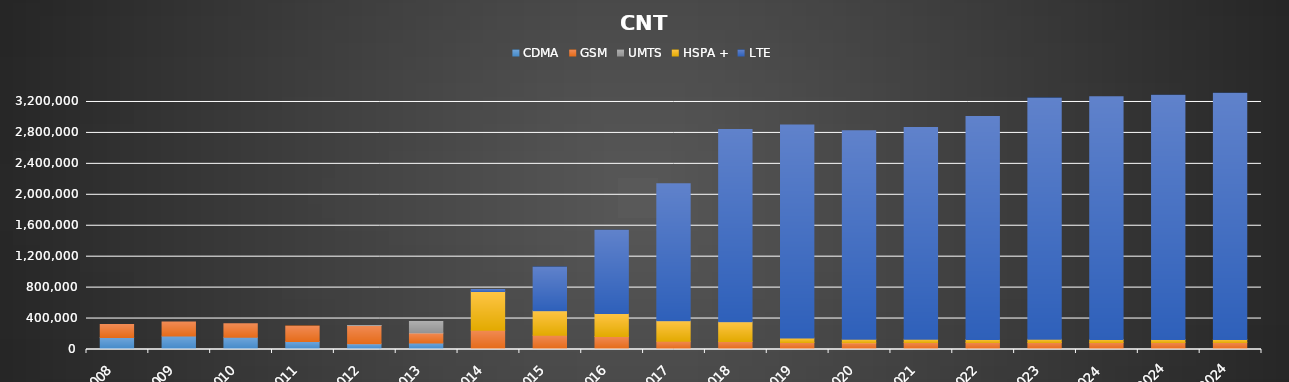
| Category | CDMA | GSM | UMTS | HSPA + | LTE |
|---|---|---|---|---|---|
| 2008 | 155151 | 168816 | 0 | 0 | 0 |
| 2009 | 173602 | 183298 | 0 | 0 | 0 |
| 2010 | 157438 | 176292 | 0 | 0 | 0 |
| 2011 | 102115 | 201253 | 0 | 0 | 0 |
| 2012 | 75179 | 233874 | 218 | 0 | 0 |
| 2013 | 83748 | 130396 | 148416 | 0 | 0 |
| 2014 | 3009 | 246983 | 0 | 498724 | 28176 |
| 2015 | 0 | 185171 | 0 | 316427 | 564105 |
| 2016 | 0 | 167794 | 0 | 297924 | 1075501 |
| 2017 | 0 | 105840 | 0 | 265966 | 1770311 |
| 2018 | 0 | 104907 | 0 | 252233 | 2488002 |
| 2019 | 0 | 90785 | 0 | 57576 | 2755329 |
| 2020 | 0 | 88328 | 0 | 42633 | 2695427 |
| 2021 | 0 | 90490 | 0 | 41720 | 2737207 |
| 2022 | 0 | 89457 | 0 | 40667 | 2881775 |
| 2023 | 0 | 91235 | 0 | 40016 | 3119071 |
| Ene 2024 | 0 | 90857 | 0 | 39987 | 3136814 |
| Feb2024 | 0 | 90666 | 0 | 39954 | 3157848 |
| Mar2024 | 0 | 90578 | 0 | 39942 | 3181430 |